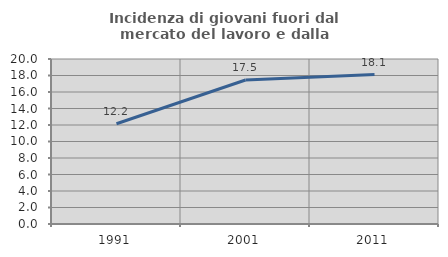
| Category | Incidenza di giovani fuori dal mercato del lavoro e dalla formazione  |
|---|---|
| 1991.0 | 12.151 |
| 2001.0 | 17.457 |
| 2011.0 | 18.117 |